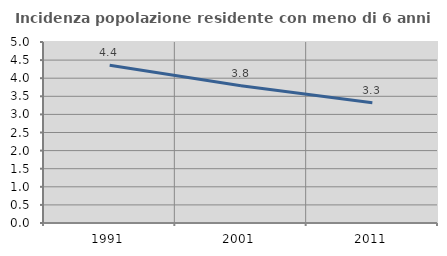
| Category | Incidenza popolazione residente con meno di 6 anni |
|---|---|
| 1991.0 | 4.359 |
| 2001.0 | 3.794 |
| 2011.0 | 3.325 |